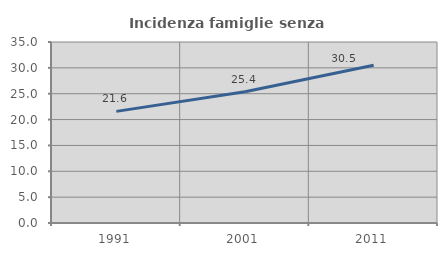
| Category | Incidenza famiglie senza nuclei |
|---|---|
| 1991.0 | 21.588 |
| 2001.0 | 25.364 |
| 2011.0 | 30.514 |